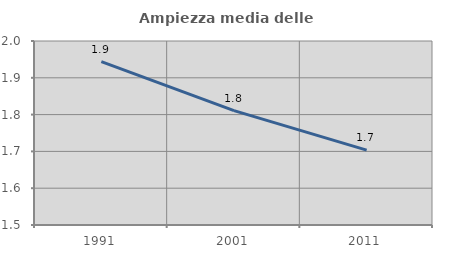
| Category | Ampiezza media delle famiglie |
|---|---|
| 1991.0 | 1.944 |
| 2001.0 | 1.811 |
| 2011.0 | 1.704 |